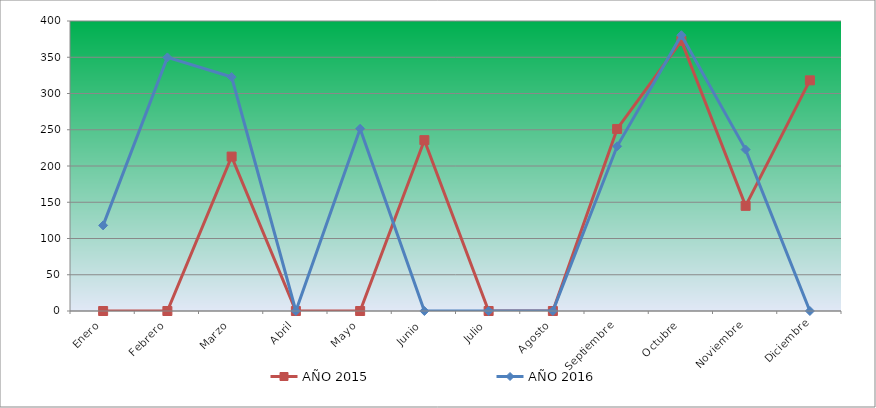
| Category | AÑO 2015 | AÑO 2016 |
|---|---|---|
| Enero | 0 | 118.087 |
| Febrero | 0 | 349.753 |
| Marzo | 213.011 | 322.71 |
| Abril | 0 | 0 |
| Mayo | 0 | 251.498 |
| Junio | 235.671 | 0 |
| Julio | 0 | 0 |
| Agosto | 0 | 0 |
| Septiembre | 251.081 | 227.159 |
| Octubre | 372.542 | 380.402 |
| Noviembre | 145.029 | 222.652 |
| Diciembre | 318.156 | 0 |